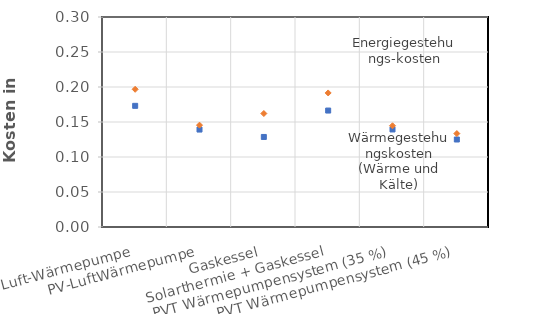
| Category | Wärmegestehungskosten (Wärme und Kälte) | Energiegestehungs-kosten |
|---|---|---|
| Luft-Wärmepumpe | 0.173 | 0.197 |
| PV-LuftWärmepumpe | 0.139 | 0.146 |
| Gaskessel | 0.129 | 0.162 |
| Solarthermie + Gaskessel | 0.166 | 0.191 |
| PVT Wärmepumpensystem (35 %) | 0.139 | 0.145 |
| PVT Wärmepumpensystem (45 %) | 0.125 | 0.133 |